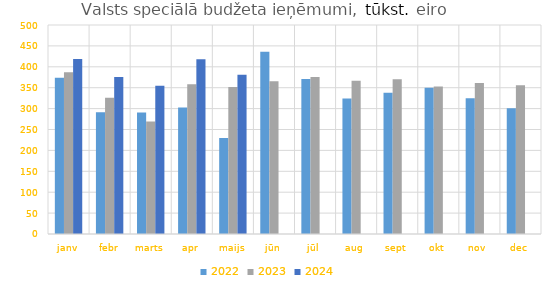
| Category | 2022 | 2023 | 2024 |
|---|---|---|---|
| janv | 373920.799 | 386755.586 | 418920.08 |
| febr | 291303.596 | 325763.822 | 375519.649 |
| marts | 290859.027 | 269347.904 | 354904.037 |
| apr | 302459.796 | 358546.386 | 418219.88 |
| maijs | 229777.32 | 351917.303 | 380821.702 |
| jūn | 435953.091 | 365282.092 | 0 |
| jūl | 370694.27 | 375551.062 | 0 |
| aug | 324382.079 | 366816.511 | 0 |
| sept | 337952.536 | 370049.791 | 0 |
| okt | 349920.822 | 352599.457 | 0 |
| nov | 324970.324 | 361097.134 | 0 |
| dec | 300963.059 | 355952.142 | 0 |